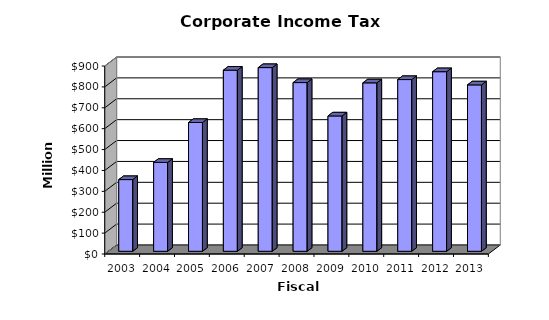
| Category | Amount |
|---|---|
| 2003.0 | 343318607 |
| 2004.0 | 425715754 |
| 2005.0 | 616690263 |
| 2006.0 | 867115786 |
| 2007.0 | 879575371 |
| 2008.0 | 807851584 |
| 2009.0 | 648032537 |
| 2010.0 | 806472760 |
| 2011.0 | 822258802.84 |
| 2012.0 | 859922839.55 |
| 2013.0 | 796728154.4 |